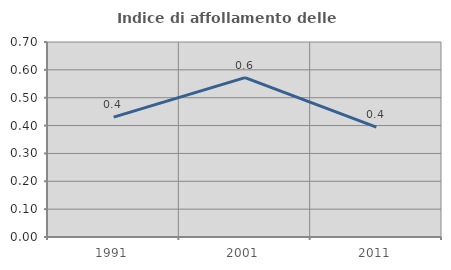
| Category | Indice di affollamento delle abitazioni  |
|---|---|
| 1991.0 | 0.43 |
| 2001.0 | 0.572 |
| 2011.0 | 0.395 |